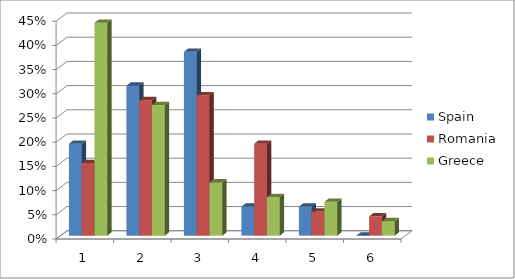
| Category | Spain | Romania | Greece |
|---|---|---|---|
| 0 | 0.19 | 0.15 | 0.44 |
| 1 | 0.31 | 0.28 | 0.27 |
| 2 | 0.38 | 0.29 | 0.11 |
| 3 | 0.06 | 0.19 | 0.08 |
| 4 | 0.06 | 0.05 | 0.07 |
| 5 | 0 | 0.04 | 0.03 |